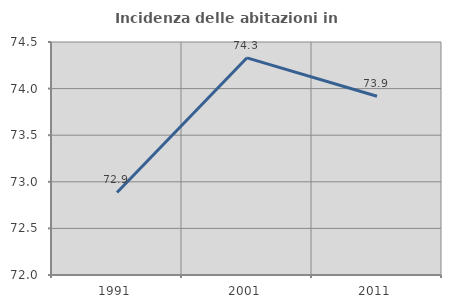
| Category | Incidenza delle abitazioni in proprietà  |
|---|---|
| 1991.0 | 72.886 |
| 2001.0 | 74.33 |
| 2011.0 | 73.918 |